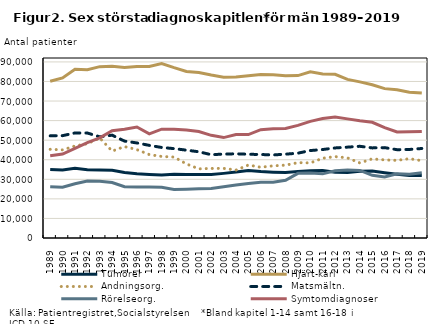
| Category | Tumörer | Hjärt-kärl | Andningsorg. | Matsmältn. | Rörelseorg. | Symtomdiagnoser |
|---|---|---|---|---|---|---|
| 1989.0 | 35062 | 80135 | 45323 | 52228 | 26226 | 42084 |
| 1990.0 | 34793 | 81811 | 45038 | 52308 | 25908 | 42897 |
| 1991.0 | 35583 | 86215 | 47018 | 53686 | 27750 | 45816 |
| 1992.0 | 34879 | 86015 | 48190 | 53663 | 29176 | 48785 |
| 1993.0 | 34796 | 87578 | 51150 | 51714 | 29047 | 51206 |
| 1994.0 | 34623 | 87813 | 44413 | 52561 | 28350 | 54810 |
| 1995.0 | 33485 | 87197 | 46715 | 49527 | 26238 | 55637 |
| 1996.0 | 32872 | 87700 | 45170 | 48581 | 26123 | 56745 |
| 1997.0 | 32473 | 87650 | 42649 | 47345 | 26124 | 53238 |
| 1998.0 | 32154 | 89183 | 41662 | 46265 | 25902 | 55639 |
| 1999.0 | 32537 | 87079 | 41373 | 45678 | 24792 | 55562 |
| 2000.0 | 32481 | 85150 | 37861 | 44895 | 24943 | 55193 |
| 2001.0 | 32498 | 84605 | 35345 | 44068 | 25152 | 54442 |
| 2002.0 | 32444 | 83306 | 35555 | 42577 | 25290 | 52472 |
| 2003.0 | 33029 | 82181 | 35595 | 42885 | 26183 | 51323 |
| 2004.0 | 33736 | 82270 | 34710 | 43043 | 27094 | 52893 |
| 2005.0 | 34541 | 82941 | 37308 | 42792 | 27892 | 52883 |
| 2006.0 | 33935 | 83512 | 36161 | 42677 | 28532 | 55359 |
| 2007.0 | 33664 | 83470 | 36876 | 42451 | 28455 | 55799 |
| 2008.0 | 33465 | 82982 | 37241 | 42846 | 29543 | 55960 |
| 2009.0 | 33978 | 83023 | 38512 | 43366 | 33051 | 57558 |
| 2010.0 | 34358 | 84946 | 38384 | 44691 | 33263 | 59611 |
| 2011.0 | 34447 | 83819 | 40775 | 45222 | 32788 | 61048 |
| 2012.0 | 33610 | 83672 | 41616 | 46035 | 34367 | 61827 |
| 2013.0 | 33530 | 81071 | 40941 | 46444 | 34732 | 60880 |
| 2014.0 | 34137 | 79800 | 38387 | 46867 | 34549 | 59930 |
| 2015.0 | 34216 | 78343 | 40462 | 46056 | 32054 | 59147 |
| 2016.0 | 33351 | 76348 | 39913 | 46193 | 31167 | 56401 |
| 2017.0 | 32597 | 75757 | 39684 | 45139 | 32835 | 54199 |
| 2018.0 | 31973 | 74499 | 40536 | 45251 | 32643 | 54331 |
| 2019.0 | 31955 | 74060 | 39538 | 45749 | 33391 | 54467 |